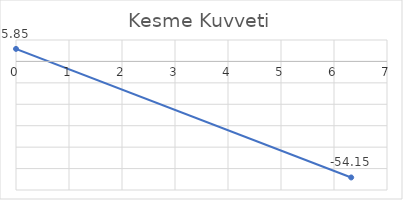
| Category | Series 0 |
|---|---|
| 0.0 | 5.853 |
| 6.324555320336759 | -54.147 |